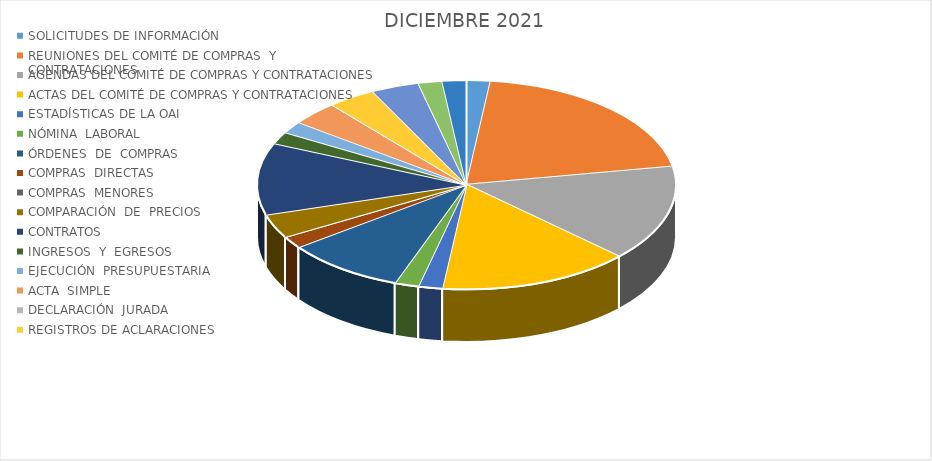
| Category | Series 0 |
|---|---|
| SOLICITUDES DE INFORMACIÓN  | 1 |
| REUNIONES DEL COMITÉ DE COMPRAS  Y  CONTRATACIONES | 11 |
| AGENDAS DEL COMITÉ DE COMPRAS Y CONTRATACIONES | 8 |
| ACTAS DEL COMITÉ DE COMPRAS Y CONTRATACIONES | 8 |
| ESTADÍSTICAS DE LA OAI | 1 |
| NÓMINA  LABORAL  | 1 |
| ÓRDENES  DE  COMPRAS | 5 |
| COMPRAS  DIRECTAS   | 1 |
| COMPRAS  MENORES | 0 |
| COMPARACIÓN  DE  PRECIOS   | 2 |
| CONTRATOS | 6 |
| INGRESOS  Y  EGRESOS | 1 |
| EJECUCIÓN  PRESUPUESTARIA   | 1 |
| ACTA  SIMPLE | 2 |
| DECLARACIÓN  JURADA   | 0 |
| REGISTROS DE ACLARACIONES   | 2 |
| ÓRDENES  DE  SERVICIOS | 2 |
| LICITACIÓN  PÚBLICA  NACIONAL | 1 |
| ESTADISTICAS DE SERVICIO | 1 |